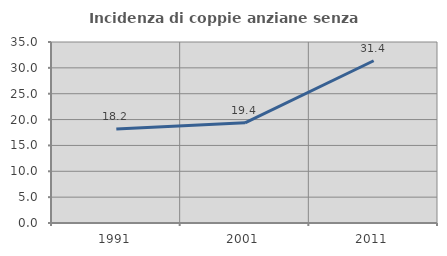
| Category | Incidenza di coppie anziane senza figli  |
|---|---|
| 1991.0 | 18.182 |
| 2001.0 | 19.38 |
| 2011.0 | 31.373 |